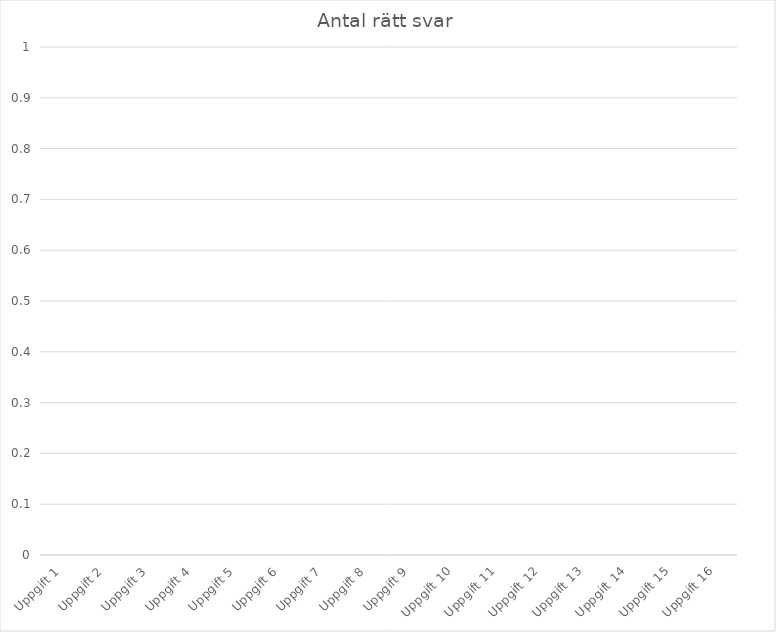
| Category | Antal elever rätt svar |
|---|---|
| Uppgift 1 | 0 |
| Uppgift 2 | 0 |
| Uppgift 3 | 0 |
| Uppgift 4 | 0 |
| Uppgift 5 | 0 |
| Uppgift 6 | 0 |
| Uppgift 7 | 0 |
| Uppgift 8 | 0 |
| Uppgift 9 | 0 |
| Uppgift 10 | 0 |
| Uppgift 11 | 0 |
| Uppgift 12 | 0 |
| Uppgift 13 | 0 |
| Uppgift 14 | 0 |
| Uppgift 15 | 0 |
| Uppgift 16 | 0 |